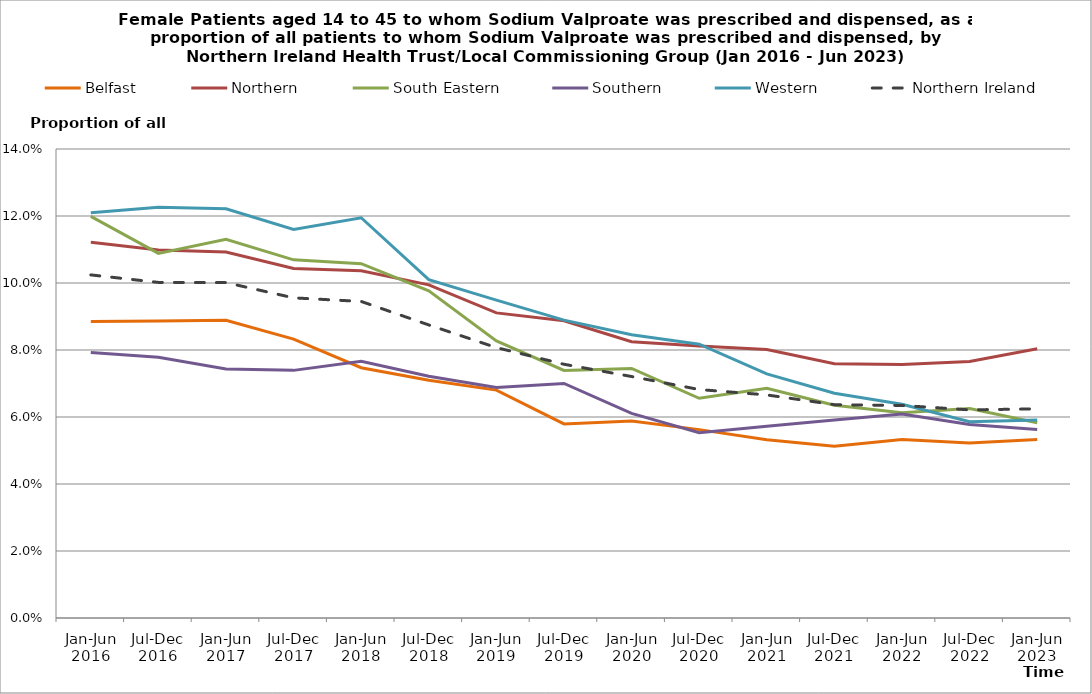
| Category | Belfast | Northern | South Eastern | Southern | Western | Northern Ireland |
|---|---|---|---|---|---|---|
| Jan-Jun 2016 | 0.089 | 0.112 | 0.12 | 0.079 | 0.121 | 0.102 |
| Jul-Dec 2016 | 0.089 | 0.11 | 0.109 | 0.078 | 0.123 | 0.1 |
| Jan-Jun 2017 | 0.089 | 0.109 | 0.113 | 0.074 | 0.122 | 0.1 |
| Jul-Dec 2017 | 0.083 | 0.104 | 0.107 | 0.074 | 0.116 | 0.096 |
| Jan-Jun 2018 | 0.075 | 0.104 | 0.106 | 0.077 | 0.119 | 0.094 |
| Jul-Dec 2018 | 0.071 | 0.099 | 0.098 | 0.072 | 0.101 | 0.087 |
| Jan-Jun 2019 | 0.068 | 0.091 | 0.083 | 0.069 | 0.095 | 0.081 |
| Jul-Dec 2019 | 0.058 | 0.089 | 0.074 | 0.07 | 0.089 | 0.076 |
| Jan-Jun 2020 | 0.059 | 0.082 | 0.075 | 0.061 | 0.085 | 0.072 |
| Jul-Dec 2020 | 0.056 | 0.081 | 0.066 | 0.055 | 0.082 | 0.068 |
| Jan-Jun 2021 | 0.053 | 0.08 | 0.069 | 0.057 | 0.073 | 0.067 |
| Jul-Dec 2021 | 0.051 | 0.076 | 0.064 | 0.059 | 0.067 | 0.064 |
| Jan-Jun 2022 | 0.053 | 0.076 | 0.061 | 0.061 | 0.064 | 0.063 |
| Jul-Dec 2022 | 0.052 | 0.077 | 0.063 | 0.058 | 0.059 | 0.062 |
| Jan-Jun 2023 | 0.053 | 0.08 | 0.058 | 0.056 | 0.059 | 0.062 |